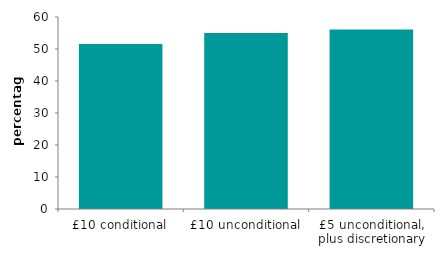
| Category | Series 0 |
|---|---|
| £10 conditional | 51.539 |
| £10 unconditional | 55.019 |
| £5 unconditional, plus discretionary | 56.121 |